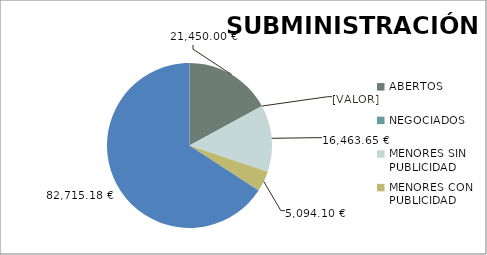
| Category | Series 0 |
|---|---|
| ABERTOS  | 21450 |
| NEGOCIADOS  | 0 |
| MENORES SIN PUBLICIDAD | 16463.65 |
| MENORES CON PUBLICIDAD | 5094.1 |
| PROCEDEMENTO SIMPLIFICADO | 82715.18 |